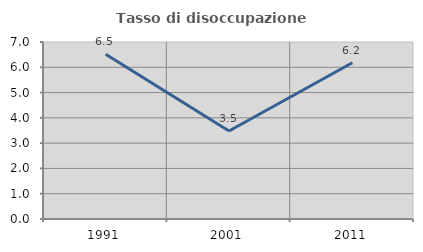
| Category | Tasso di disoccupazione giovanile  |
|---|---|
| 1991.0 | 6.518 |
| 2001.0 | 3.478 |
| 2011.0 | 6.18 |